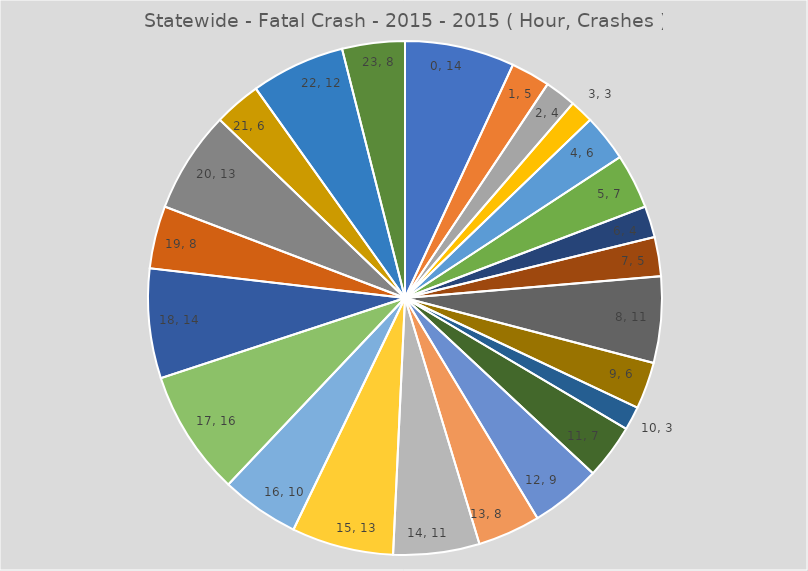
| Category | Statewide - Fatal Crash - 2015 - 2015 ( Hour, Crashes ) |
|---|---|
| 0.0 | 14 |
| 1.0 | 5 |
| 2.0 | 4 |
| 3.0 | 3 |
| 4.0 | 6 |
| 5.0 | 7 |
| 6.0 | 4 |
| 7.0 | 5 |
| 8.0 | 11 |
| 9.0 | 6 |
| 10.0 | 3 |
| 11.0 | 7 |
| 12.0 | 9 |
| 13.0 | 8 |
| 14.0 | 11 |
| 15.0 | 13 |
| 16.0 | 10 |
| 17.0 | 16 |
| 18.0 | 14 |
| 19.0 | 8 |
| 20.0 | 13 |
| 21.0 | 6 |
| 22.0 | 12 |
| 23.0 | 8 |